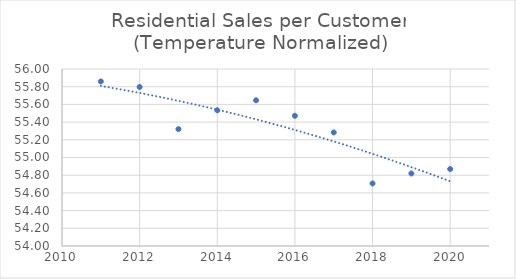
| Category | Series 0 |
|---|---|
| 2020.0 | 54.87 |
| 2019.0 | 54.819 |
| 2018.0 | 54.707 |
| 2017.0 | 55.283 |
| 2016.0 | 55.471 |
| 2015.0 | 55.646 |
| 2014.0 | 55.534 |
| 2013.0 | 55.321 |
| 2012.0 | 55.797 |
| 2011.0 | 55.859 |